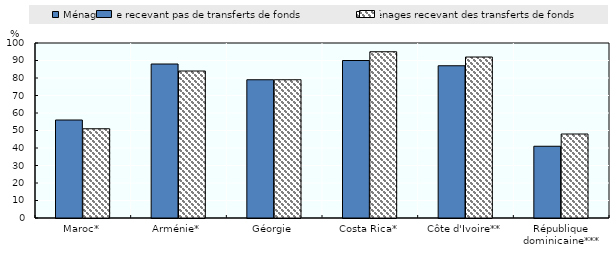
| Category | Ménages ne recevant pas de transferts de fonds | Ménages recevant des transferts de fonds |
|---|---|---|
| Maroc* | 56 | 51 |
| Arménie* | 88 | 84 |
| Géorgie | 79 | 79 |
| Costa Rica* | 90 | 95 |
| Côte d'Ivoire** | 87 | 92 |
| République dominicaine*** | 41 | 48 |